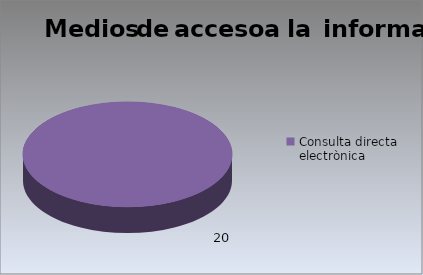
| Category | Series 0 |
|---|---|
| Consulta directa electrònica | 20 |